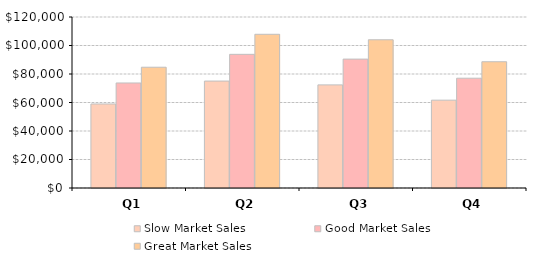
| Category | Slow Market Sales | Good Market Sales | Great Market Sales |
|---|---|---|---|
| Q1 | 58960 | 73700 | 84755 |
| Q2 | 75040 | 93800 | 107870 |
| Q3 | 72360 | 90450 | 104017.5 |
| Q4 | 61640 | 77050 | 88607.5 |